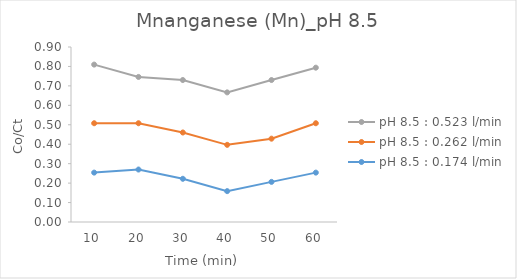
| Category | pH 8.5 : 0.174 l/min | pH 8.5 : 0.262 l/min | pH 8.5 : 0.523 l/min |
|---|---|---|---|
| 10.0 | 0.254 | 0.254 | 0.302 |
| 20.0 | 0.27 | 0.238 | 0.238 |
| 30.0 | 0.222 | 0.238 | 0.27 |
| 40.0 | 0.159 | 0.238 | 0.27 |
| 50.0 | 0.206 | 0.222 | 0.302 |
| 60.0 | 0.254 | 0.254 | 0.286 |